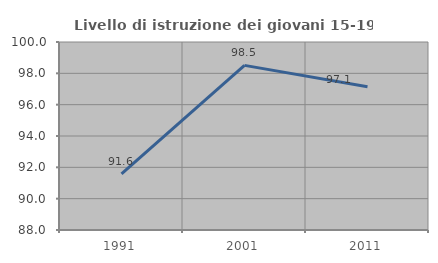
| Category | Livello di istruzione dei giovani 15-19 anni |
|---|---|
| 1991.0 | 91.579 |
| 2001.0 | 98.507 |
| 2011.0 | 97.143 |